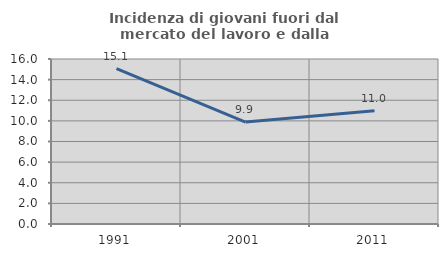
| Category | Incidenza di giovani fuori dal mercato del lavoro e dalla formazione  |
|---|---|
| 1991.0 | 15.056 |
| 2001.0 | 9.883 |
| 2011.0 | 10.974 |